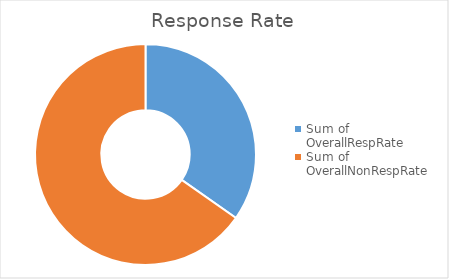
| Category | Total |
|---|---|
| Sum of OverallRespRate | 34.737 |
| Sum of OverallNonRespRate | 65.263 |